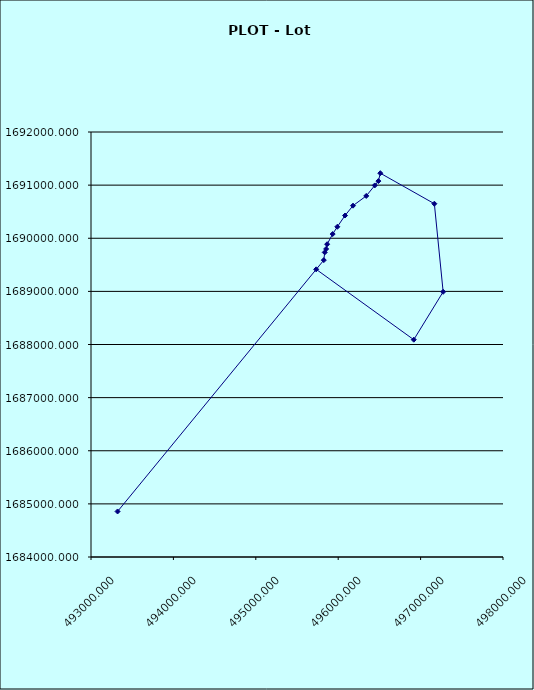
| Category | Series 0 |
|---|---|
| 493322.274 | 1684856.777 |
| 495825.215 | 1689588.431 |
| 495836.6708 | 1689733.656 |
| 495853.8201 | 1689798.502 |
| 495865.7979 | 1689888.049 |
| 495932.7811 | 1690078.899 |
| 495989.451 | 1690216.059 |
| 496082.8891 | 1690427.719 |
| 496179.8577 | 1690613.469 |
| 496340.4773 | 1690796.737 |
| 496443.582 | 1690994.095 |
| 496487.5945 | 1691076.146 |
| 496510.9981 | 1691224.68 |
| 497166.799 | 1690650.175 |
| 497273.656 | 1688991.983 |
| 496917.089 | 1688090.376 |
| 495732.792 | 1689414.754 |